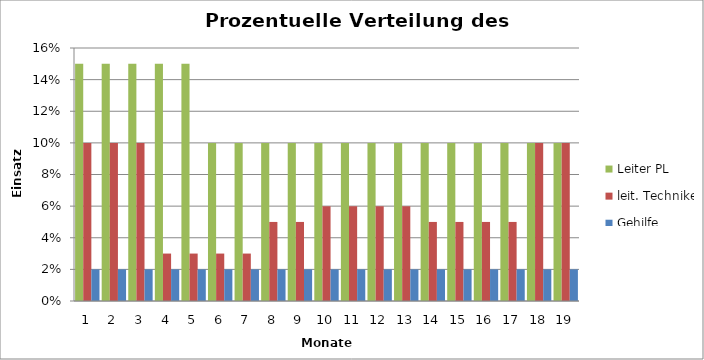
| Category | Leiter PL | leit. Techniker | Gehilfe |
|---|---|---|---|
| 0 | 0.15 | 0.1 | 0.02 |
| 1 | 0.15 | 0.1 | 0.02 |
| 2 | 0.15 | 0.1 | 0.02 |
| 3 | 0.15 | 0.03 | 0.02 |
| 4 | 0.15 | 0.03 | 0.02 |
| 5 | 0.1 | 0.03 | 0.02 |
| 6 | 0.1 | 0.03 | 0.02 |
| 7 | 0.1 | 0.05 | 0.02 |
| 8 | 0.1 | 0.05 | 0.02 |
| 9 | 0.1 | 0.06 | 0.02 |
| 10 | 0.1 | 0.06 | 0.02 |
| 11 | 0.1 | 0.06 | 0.02 |
| 12 | 0.1 | 0.06 | 0.02 |
| 13 | 0.1 | 0.05 | 0.02 |
| 14 | 0.1 | 0.05 | 0.02 |
| 15 | 0.1 | 0.05 | 0.02 |
| 16 | 0.1 | 0.05 | 0.02 |
| 17 | 0.1 | 0.1 | 0.02 |
| 18 | 0.1 | 0.1 | 0.02 |